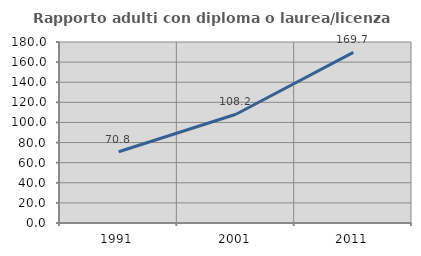
| Category | Rapporto adulti con diploma o laurea/licenza media  |
|---|---|
| 1991.0 | 70.826 |
| 2001.0 | 108.162 |
| 2011.0 | 169.716 |